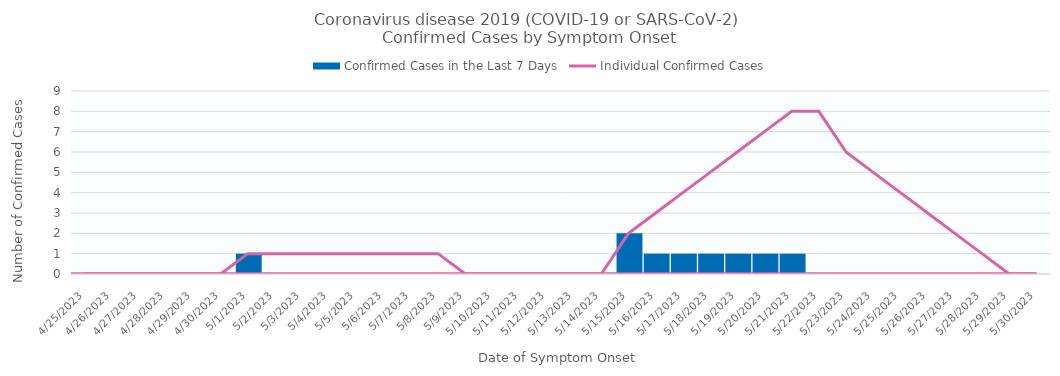
| Category | Confirmed Cases in the Last 7 Days |
|---|---|
| 4/25/23 | 0 |
| 4/26/23 | 0 |
| 4/27/23 | 0 |
| 4/28/23 | 0 |
| 4/29/23 | 0 |
| 4/30/23 | 0 |
| 5/1/23 | 1 |
| 5/2/23 | 0 |
| 5/3/23 | 0 |
| 5/4/23 | 0 |
| 5/5/23 | 0 |
| 5/6/23 | 0 |
| 5/7/23 | 0 |
| 5/8/23 | 0 |
| 5/9/23 | 0 |
| 5/10/23 | 0 |
| 5/11/23 | 0 |
| 5/12/23 | 0 |
| 5/13/23 | 0 |
| 5/14/23 | 0 |
| 5/15/23 | 2 |
| 5/16/23 | 1 |
| 5/17/23 | 1 |
| 5/18/23 | 1 |
| 5/19/23 | 1 |
| 5/20/23 | 1 |
| 5/21/23 | 1 |
| 5/22/23 | 0 |
| 5/23/23 | 0 |
| 5/24/23 | 0 |
| 5/25/23 | 0 |
| 5/26/23 | 0 |
| 5/27/23 | 0 |
| 5/28/23 | 0 |
| 5/29/23 | 0 |
| 5/30/23 | 0 |
| nan | 0 |
| nan | 0 |
| nan | 0 |
| nan | 0 |
| nan | 0 |
| nan | 0 |
| nan | 0 |
| nan | 0 |
| nan | 0 |
| nan | 0 |
| nan | 0 |
| nan | 0 |
| nan | 0 |
| nan | 0 |
| nan | 0 |
| nan | 0 |
| nan | 0 |
| nan | 0 |
| nan | 0 |
| nan | 0 |
| nan | 0 |
| nan | 0 |
| nan | 0 |
| nan | 0 |
| nan | 0 |
| nan | 0 |
| nan | 0 |
| nan | 0 |
| nan | 0 |
| nan | 0 |
| nan | 0 |
| nan | 0 |
| nan | 0 |
| nan | 0 |
| nan | 0 |
| nan | 0 |
| nan | 0 |
| nan | 0 |
| nan | 0 |
| nan | 0 |
| nan | 0 |
| nan | 0 |
| nan | 0 |
| nan | 0 |
| nan | 0 |
| nan | 0 |
| nan | 0 |
| nan | 0 |
| nan | 0 |
| nan | 0 |
| nan | 0 |
| nan | 0 |
| nan | 0 |
| nan | 0 |
| nan | 0 |
| nan | 0 |
| nan | 0 |
| nan | 0 |
| nan | 0 |
| nan | 0 |
| nan | 0 |
| nan | 0 |
| nan | 0 |
| nan | 0 |
| nan | 0 |
| nan | 0 |
| nan | 0 |
| nan | 0 |
| nan | 0 |
| nan | 0 |
| nan | 0 |
| nan | 0 |
| nan | 0 |
| nan | 0 |
| nan | 0 |
| nan | 0 |
| nan | 0 |
| nan | 0 |
| nan | 0 |
| nan | 0 |
| nan | 0 |
| nan | 0 |
| nan | 0 |
| nan | 0 |
| nan | 0 |
| nan | 0 |
| nan | 0 |
| nan | 0 |
| nan | 0 |
| nan | 0 |
| nan | 0 |
| nan | 0 |
| nan | 0 |
| nan | 0 |
| nan | 0 |
| nan | 0 |
| nan | 0 |
| nan | 0 |
| nan | 0 |
| nan | 0 |
| nan | 0 |
| nan | 0 |
| nan | 0 |
| nan | 0 |
| nan | 0 |
| nan | 0 |
| nan | 0 |
| nan | 0 |
| nan | 0 |
| nan | 0 |
| nan | 0 |
| nan | 0 |
| nan | 0 |
| nan | 0 |
| nan | 0 |
| nan | 0 |
| nan | 0 |
| nan | 0 |
| nan | 0 |
| nan | 0 |
| nan | 0 |
| nan | 0 |
| nan | 0 |
| nan | 0 |
| nan | 0 |
| nan | 0 |
| nan | 0 |
| nan | 0 |
| nan | 0 |
| nan | 0 |
| nan | 0 |
| nan | 0 |
| nan | 0 |
| nan | 0 |
| nan | 0 |
| nan | 0 |
| nan | 0 |
| nan | 0 |
| nan | 0 |
| nan | 0 |
| nan | 0 |
| nan | 0 |
| nan | 0 |
| nan | 0 |
| nan | 0 |
| nan | 0 |
| nan | 0 |
| nan | 0 |
| nan | 0 |
| nan | 0 |
| nan | 0 |
| nan | 0 |
| nan | 0 |
| nan | 0 |
| nan | 0 |
| nan | 0 |
| nan | 0 |
| nan | 0 |
| nan | 0 |
| nan | 0 |
| nan | 0 |
| nan | 0 |
| nan | 0 |
| nan | 0 |
| nan | 0 |
| nan | 0 |
| nan | 0 |
| nan | 0 |
| nan | 0 |
| nan | 0 |
| nan | 0 |
| nan | 0 |
| nan | 0 |
| nan | 0 |
| nan | 0 |
| nan | 0 |
| nan | 0 |
| nan | 0 |
| nan | 0 |
| nan | 0 |
| nan | 0 |
| nan | 0 |
| nan | 0 |
| nan | 0 |
| nan | 0 |
| nan | 0 |
| nan | 0 |
| nan | 0 |
| nan | 0 |
| nan | 0 |
| nan | 0 |
| nan | 0 |
| nan | 0 |
| nan | 0 |
| nan | 0 |
| nan | 0 |
| nan | 0 |
| nan | 0 |
| nan | 0 |
| nan | 0 |
| nan | 0 |
| nan | 0 |
| nan | 0 |
| nan | 0 |
| nan | 0 |
| nan | 0 |
| nan | 0 |
| nan | 0 |
| nan | 0 |
| nan | 0 |
| nan | 0 |
| nan | 0 |
| nan | 0 |
| nan | 0 |
| nan | 0 |
| nan | 0 |
| nan | 0 |
| nan | 0 |
| nan | 0 |
| nan | 0 |
| nan | 0 |
| nan | 0 |
| nan | 0 |
| nan | 0 |
| nan | 0 |
| nan | 0 |
| nan | 0 |
| nan | 0 |
| nan | 0 |
| nan | 0 |
| nan | 0 |
| nan | 0 |
| nan | 0 |
| nan | 0 |
| nan | 0 |
| nan | 0 |
| nan | 0 |
| nan | 0 |
| nan | 0 |
| nan | 0 |
| nan | 0 |
| nan | 0 |
| nan | 0 |
| nan | 0 |
| nan | 0 |
| nan | 0 |
| nan | 0 |
| nan | 0 |
| nan | 0 |
| nan | 0 |
| nan | 0 |
| nan | 0 |
| nan | 0 |
| nan | 0 |
| nan | 0 |
| nan | 0 |
| nan | 0 |
| nan | 0 |
| nan | 0 |
| nan | 0 |
| nan | 0 |
| nan | 0 |
| nan | 0 |
| nan | 0 |
| nan | 0 |
| nan | 0 |
| nan | 0 |
| nan | 0 |
| nan | 0 |
| nan | 0 |
| nan | 0 |
| nan | 0 |
| nan | 0 |
| nan | 0 |
| nan | 0 |
| nan | 0 |
| nan | 0 |
| nan | 0 |
| nan | 0 |
| nan | 0 |
| nan | 0 |
| nan | 0 |
| nan | 0 |
| nan | 0 |
| nan | 0 |
| nan | 0 |
| nan | 0 |
| nan | 0 |
| nan | 0 |
| nan | 0 |
| nan | 0 |
| nan | 0 |
| nan | 0 |
| nan | 0 |
| nan | 0 |
| nan | 0 |
| nan | 0 |
| nan | 0 |
| nan | 0 |
| nan | 0 |
| nan | 0 |
| nan | 0 |
| nan | 0 |
| nan | 0 |
| nan | 0 |
| nan | 0 |
| nan | 0 |
| nan | 0 |
| nan | 0 |
| nan | 0 |
| nan | 0 |
| nan | 0 |
| nan | 0 |
| nan | 0 |
| nan | 0 |
| nan | 0 |
| nan | 0 |
| nan | 0 |
| nan | 0 |
| nan | 0 |
| nan | 0 |
| nan | 0 |
| nan | 0 |
| nan | 0 |
| nan | 0 |
| nan | 0 |
| nan | 0 |
| nan | 0 |
| nan | 0 |